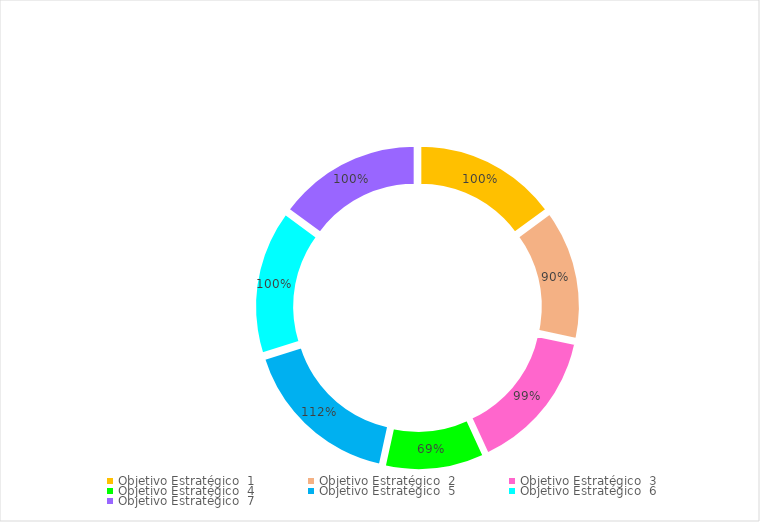
| Category | 100% |
|---|---|
| Objetivo Estratégico  1 | 1 |
| Objetivo Estratégico  2 | 0.9 |
| Objetivo Estratégico  3 | 0.99 |
| Objetivo Estratégico  4 | 0.69 |
| Objetivo Estratégico  5 | 1.12 |
| Objetivo Estratégico  6 | 1 |
| Objetivo Estratégico  7 | 1 |